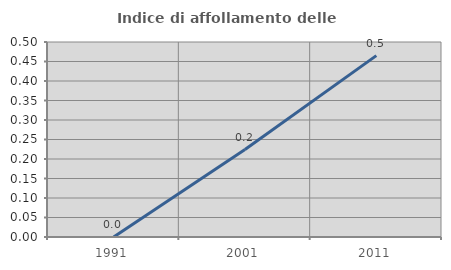
| Category | Indice di affollamento delle abitazioni  |
|---|---|
| 1991.0 | 0 |
| 2001.0 | 0.224 |
| 2011.0 | 0.465 |